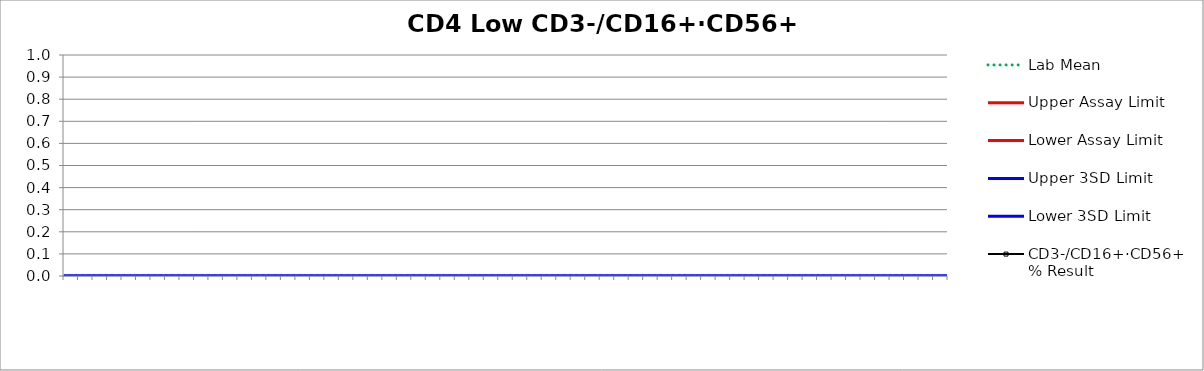
| Category | Lab Mean | Upper Assay Limit | Lower Assay Limit | Upper 3SD Limit | Lower 3SD Limit | CD3-/CD16+·CD56+ % Result |
|---|---|---|---|---|---|---|
|  | 0 |  |  | 0 | 0 |  |
|  | 0 |  |  | 0 | 0 |  |
|  | 0 |  |  | 0 | 0 |  |
|  | 0 |  |  | 0 | 0 |  |
|  | 0 |  |  | 0 | 0 |  |
|  | 0 |  |  | 0 | 0 |  |
|  | 0 |  |  | 0 | 0 |  |
|  | 0 |  |  | 0 | 0 |  |
|  | 0 |  |  | 0 | 0 |  |
|  | 0 |  |  | 0 | 0 |  |
|  | 0 |  |  | 0 | 0 |  |
|  | 0 |  |  | 0 | 0 |  |
|  | 0 |  |  | 0 | 0 |  |
|  | 0 |  |  | 0 | 0 |  |
|  | 0 |  |  | 0 | 0 |  |
|  | 0 |  |  | 0 | 0 |  |
|  | 0 |  |  | 0 | 0 |  |
|  | 0 |  |  | 0 | 0 |  |
|  | 0 |  |  | 0 | 0 |  |
|  | 0 |  |  | 0 | 0 |  |
|  | 0 |  |  | 0 | 0 |  |
|  | 0 |  |  | 0 | 0 |  |
|  | 0 |  |  | 0 | 0 |  |
|  | 0 |  |  | 0 | 0 |  |
|  | 0 |  |  | 0 | 0 |  |
|  | 0 |  |  | 0 | 0 |  |
|  | 0 |  |  | 0 | 0 |  |
|  | 0 |  |  | 0 | 0 |  |
|  | 0 |  |  | 0 | 0 |  |
|  | 0 |  |  | 0 | 0 |  |
|  | 0 |  |  | 0 | 0 |  |
|  | 0 |  |  | 0 | 0 |  |
|  | 0 |  |  | 0 | 0 |  |
|  | 0 |  |  | 0 | 0 |  |
|  | 0 |  |  | 0 | 0 |  |
|  | 0 |  |  | 0 | 0 |  |
|  | 0 |  |  | 0 | 0 |  |
|  | 0 |  |  | 0 | 0 |  |
|  | 0 |  |  | 0 | 0 |  |
|  | 0 |  |  | 0 | 0 |  |
|  | 0 |  |  | 0 | 0 |  |
|  | 0 |  |  | 0 | 0 |  |
|  | 0 |  |  | 0 | 0 |  |
|  | 0 |  |  | 0 | 0 |  |
|  | 0 |  |  | 0 | 0 |  |
|  | 0 |  |  | 0 | 0 |  |
|  | 0 |  |  | 0 | 0 |  |
|  | 0 |  |  | 0 | 0 |  |
|  | 0 |  |  | 0 | 0 |  |
|  | 0 |  |  | 0 | 0 |  |
|  | 0 |  |  | 0 | 0 |  |
|  | 0 |  |  | 0 | 0 |  |
|  | 0 |  |  | 0 | 0 |  |
|  | 0 |  |  | 0 | 0 |  |
|  | 0 |  |  | 0 | 0 |  |
|  | 0 |  |  | 0 | 0 |  |
|  | 0 |  |  | 0 | 0 |  |
|  | 0 |  |  | 0 | 0 |  |
|  | 0 |  |  | 0 | 0 |  |
|  | 0 |  |  | 0 | 0 |  |
|  | 0 |  |  | 0 | 0 |  |
|  | 0 |  |  | 0 | 0 |  |